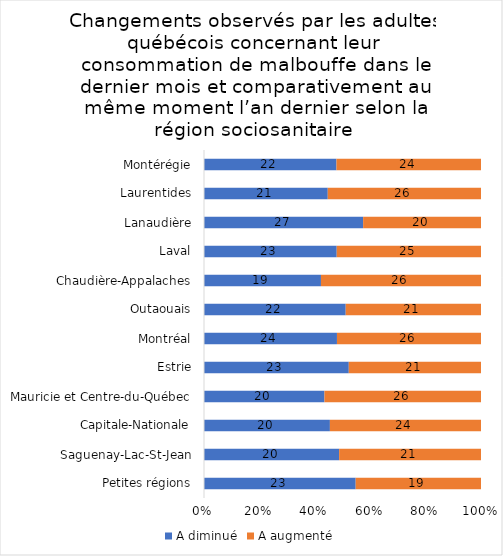
| Category | A diminué | A augmenté |
|---|---|---|
| Petites régions | 23 | 19 |
| Saguenay-Lac-St-Jean | 20 | 21 |
| Capitale-Nationale | 20 | 24 |
| Mauricie et Centre-du-Québec | 20 | 26 |
| Estrie | 23 | 21 |
| Montréal | 24 | 26 |
| Outaouais | 22 | 21 |
| Chaudière-Appalaches | 19 | 26 |
| Laval | 23 | 25 |
| Lanaudière | 27 | 20 |
| Laurentides | 21 | 26 |
| Montérégie | 22 | 24 |